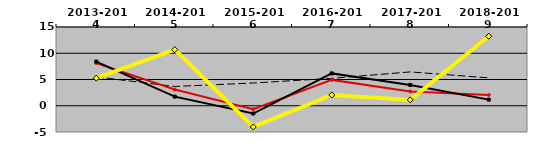
| Category | Baseline |  WEST MEDIAN | NATIONAL MEDIAN | TEXAS LUTHERAN |
|---|---|---|---|---|
| 2013-2014 | 5.492 | 8.123 | 8.415 | 5.258 |
| 2014-2015 | 3.67 | 3.088 | 1.73 | 10.692 |
| 2015-2016 | 4.335 | -0.651 | -1.479 | -4.036 |
| 2016-2017 | 5.22 | 4.925 | 6.164 | 2.053 |
| 2017-2018 | 6.45 | 2.732 | 3.963 | 1.117 |
| 2018-2019 | 5.311 | 2.057 | 1.169 | 13.237 |